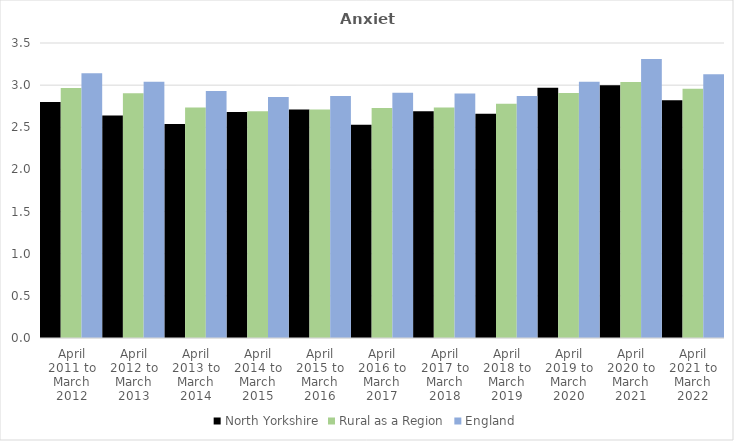
| Category | North Yorkshire | Rural as a Region | England |
|---|---|---|---|
| April 2011 to March 2012 | 2.8 | 2.967 | 3.14 |
| April 2012 to March 2013 | 2.64 | 2.904 | 3.04 |
| April 2013 to March 2014 | 2.54 | 2.734 | 2.93 |
| April 2014 to March 2015 | 2.68 | 2.691 | 2.86 |
| April 2015 to March 2016 | 2.71 | 2.711 | 2.87 |
| April 2016 to March 2017 | 2.53 | 2.729 | 2.91 |
| April 2017 to March 2018 | 2.69 | 2.736 | 2.9 |
| April 2018 to March 2019 | 2.66 | 2.78 | 2.87 |
| April 2019 to March 2020 | 2.97 | 2.908 | 3.04 |
| April 2020 to March 2021 | 3 | 3.036 | 3.31 |
| April 2021 to March 2022 | 2.82 | 2.956 | 3.13 |